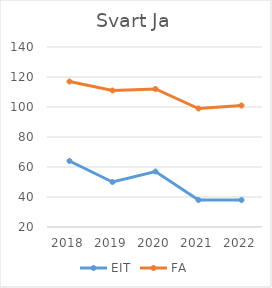
| Category | EIT | FA |
|---|---|---|
| 2018 | 64 | 117 |
| 2019 | 50 | 111 |
| 2020 | 57 | 112 |
| 2021 | 38 | 99 |
| 2022 | 38 | 101 |